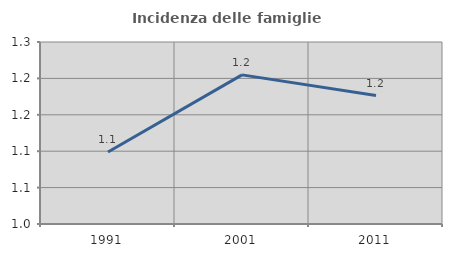
| Category | Incidenza delle famiglie numerose |
|---|---|
| 1991.0 | 1.099 |
| 2001.0 | 1.205 |
| 2011.0 | 1.176 |